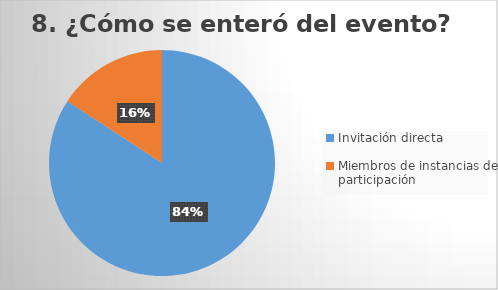
| Category | Series 0 |
|---|---|
| Invitación directa | 16 |
| Miembros de instancias de participación | 3 |